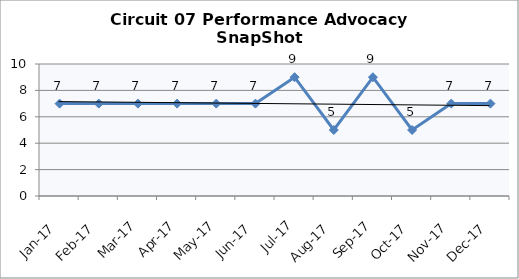
| Category | Circuit 07 |
|---|---|
| Jan-17 | 7 |
| Feb-17 | 7 |
| Mar-17 | 7 |
| Apr-17 | 7 |
| May-17 | 7 |
| Jun-17 | 7 |
| Jul-17 | 9 |
| Aug-17 | 5 |
| Sep-17 | 9 |
| Oct-17 | 5 |
| Nov-17 | 7 |
| Dec-17 | 7 |